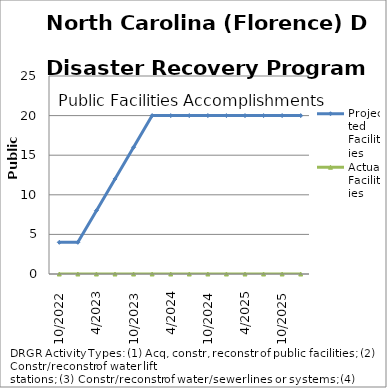
| Category | Projected Facilities | Actual Facilities |
|---|---|---|
| 10/2022 | 4 | 0 |
| 1/2023 | 4 | 0 |
| 4/2023 | 8 | 0 |
| 7/2023 | 12 | 0 |
| 10/2023 | 16 | 0 |
| 1/2024 | 20 | 0 |
| 4/2024 | 20 | 0 |
| 7/2024 | 20 | 0 |
| 10/2024 | 20 | 0 |
| 1/2025 | 20 | 0 |
| 4/2025 | 20 | 0 |
| 7/2025 | 20 | 0 |
| 10/2025 | 20 | 0 |
| 1/2026 | 20 | 0 |